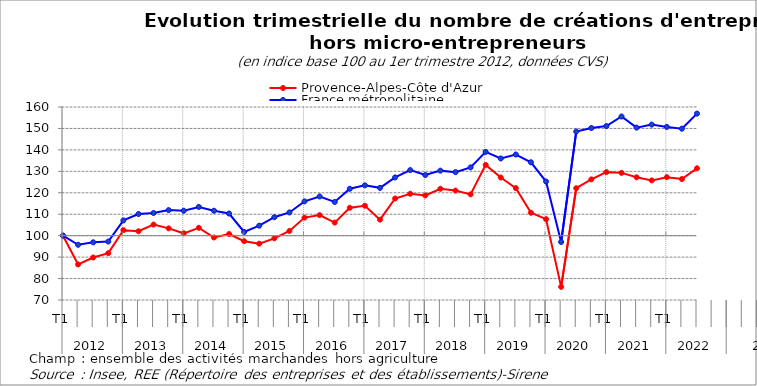
| Category | Provence-Alpes-Côte d'Azur | France métropolitaine |
|---|---|---|
| 0 | 100 | 100 |
| 1 | 86.585 | 95.751 |
| 2 | 89.814 | 96.9 |
| 3 | 91.838 | 97.264 |
| 4 | 102.564 | 107.113 |
| 5 | 102.051 | 110.094 |
| 6 | 105.183 | 110.572 |
| 7 | 103.409 | 111.913 |
| 8 | 101.095 | 111.623 |
| 9 | 103.672 | 113.408 |
| 10 | 99.155 | 111.62 |
| 11 | 100.762 | 110.323 |
| 12 | 97.436 | 101.714 |
| 13 | 96.272 | 104.666 |
| 14 | 98.753 | 108.608 |
| 15 | 102.19 | 110.826 |
| 16 | 108.426 | 115.992 |
| 17 | 109.59 | 118.29 |
| 18 | 106.098 | 115.711 |
| 19 | 112.999 | 121.863 |
| 20 | 113.955 | 123.446 |
| 21 | 107.47 | 122.299 |
| 22 | 117.323 | 127.16 |
| 23 | 119.54 | 130.567 |
| 24 | 118.75 | 128.274 |
| 25 | 121.868 | 130.325 |
| 26 | 121.037 | 129.632 |
| 27 | 119.263 | 131.847 |
| 28 | 133.01 | 139.061 |
| 29 | 127.12 | 135.995 |
| 30 | 122.173 | 137.85 |
| 31 | 110.685 | 134.229 |
| 32 | 107.691 | 125.247 |
| 33 | 76.123 | 97.067 |
| 34 | 122.131 | 148.564 |
| 35 | 126.247 | 150.194 |
| 36 | 129.629 | 151.12 |
| 37 | 129.282 | 155.577 |
| 38 | 127.203 | 150.388 |
| 39 | 125.776 | 151.802 |
| 40 | 127.273 | 150.701 |
| 41 | 126.4 | 149.881 |
| 42 | 131.416 | 156.921 |